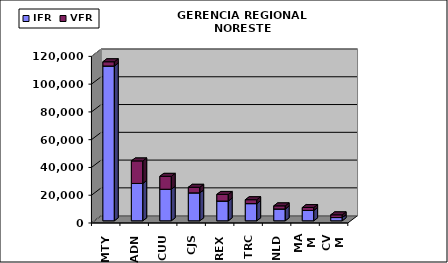
| Category | IFR | VFR |
|---|---|---|
| MTY | 111480 | 3050 |
| ADN | 26897 | 16219 |
| CUU | 22729 | 9305 |
| CJS | 20118 | 4029 |
| REX | 14236 | 4773 |
| TRC | 12382 | 2800 |
| NLD | 8512 | 2243 |
| MAM | 7461 | 2101 |
| CVM | 2336 | 1953 |